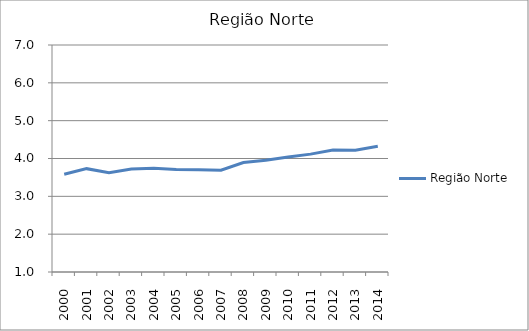
| Category | Região Norte |
|---|---|
| 2000.0 | 3.584 |
| 2001.0 | 3.732 |
| 2002.0 | 3.625 |
| 2003.0 | 3.72 |
| 2004.0 | 3.745 |
| 2005.0 | 3.709 |
| 2006.0 | 3.704 |
| 2007.0 | 3.69 |
| 2008.0 | 3.894 |
| 2009.0 | 3.953 |
| 2010.0 | 4.037 |
| 2011.0 | 4.116 |
| 2012.0 | 4.224 |
| 2013.0 | 4.216 |
| 2014.0 | 4.325 |